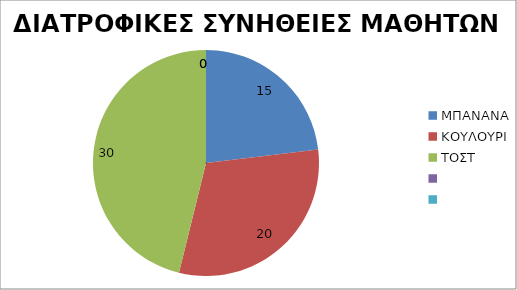
| Category | ΠΟΣΟΤΗΤΑ |
|---|---|
| ΜΠΑΝΑΝΑ | 15 |
| ΚΟΥΛΟΥΡΙ | 20 |
| ΤΟΣΤ | 30 |